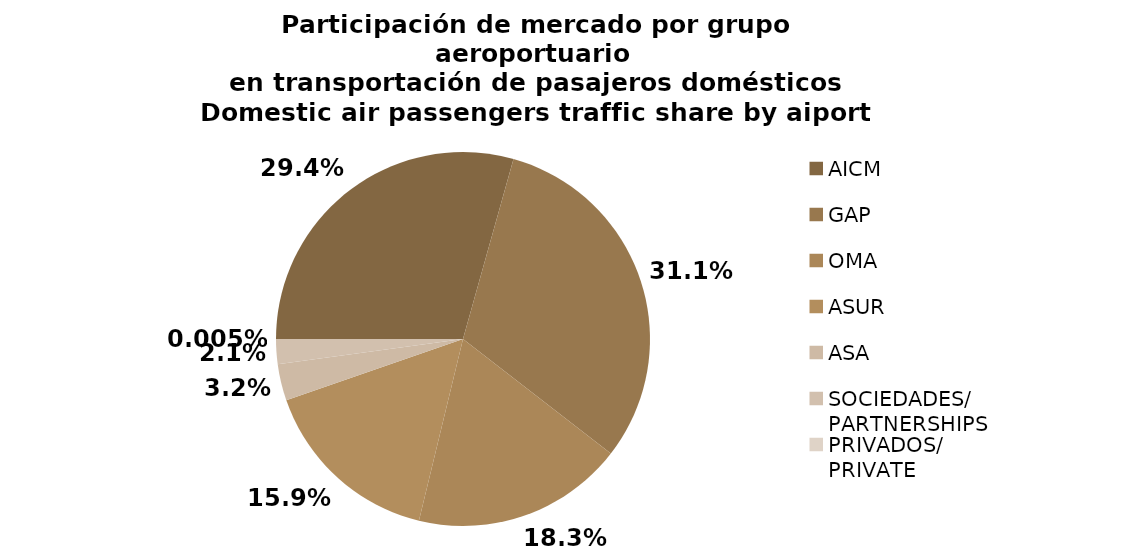
| Category | Series 0 |
|---|---|
| AICM | 2860.006 |
| GAP | 3033.653 |
| OMA | 1783.166 |
| ASUR | 1549.553 |
| ASA | 308.131 |
| SOCIEDADES/
PARTNERSHIPS | 208.668 |
| PRIVADOS/
PRIVATE | 0.493 |